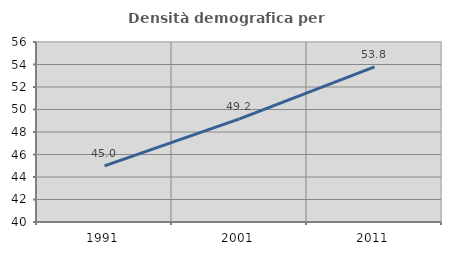
| Category | Densità demografica |
|---|---|
| 1991.0 | 44.985 |
| 2001.0 | 49.17 |
| 2011.0 | 53.781 |